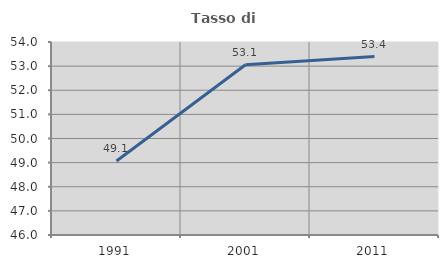
| Category | Tasso di occupazione   |
|---|---|
| 1991.0 | 49.066 |
| 2001.0 | 53.058 |
| 2011.0 | 53.399 |